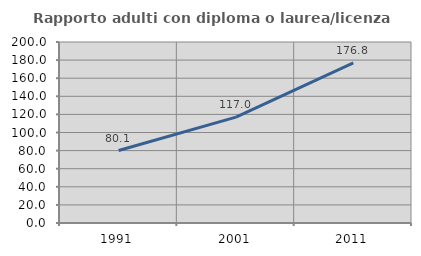
| Category | Rapporto adulti con diploma o laurea/licenza media  |
|---|---|
| 1991.0 | 80.082 |
| 2001.0 | 117.041 |
| 2011.0 | 176.842 |